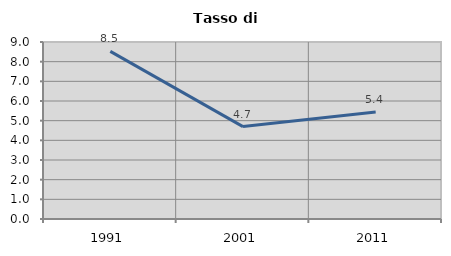
| Category | Tasso di disoccupazione   |
|---|---|
| 1991.0 | 8.525 |
| 2001.0 | 4.698 |
| 2011.0 | 5.44 |